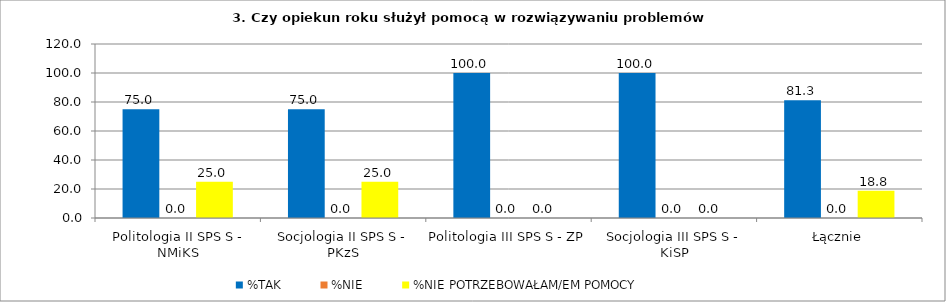
| Category | %TAK | %NIE | %NIE POTRZEBOWAŁAM/EM POMOCY |
|---|---|---|---|
| Politologia II SPS S - NMiKS | 75 | 0 | 25 |
| Socjologia II SPS S - PKzS | 75 | 0 | 25 |
| Politologia III SPS S - ZP | 100 | 0 | 0 |
| Socjologia III SPS S - KiSP | 100 | 0 | 0 |
| Łącznie | 81.25 | 0 | 18.75 |